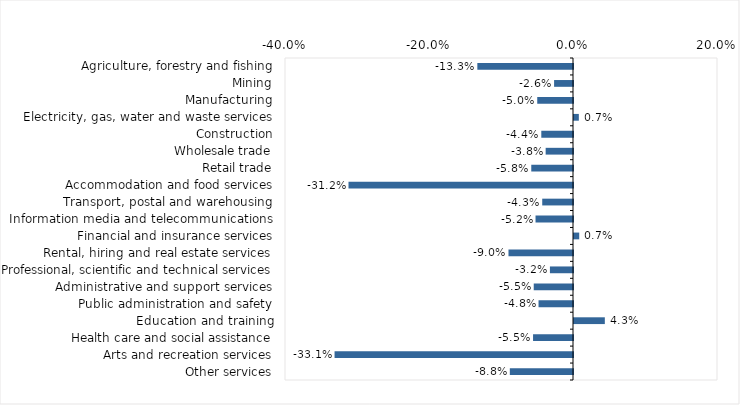
| Category | This week |
|---|---|
| Agriculture, forestry and fishing | -0.133 |
| Mining | -0.026 |
| Manufacturing | -0.05 |
| Electricity, gas, water and waste services | 0.007 |
| Construction | -0.044 |
| Wholesale trade | -0.038 |
| Retail trade | -0.058 |
| Accommodation and food services | -0.312 |
| Transport, postal and warehousing | -0.043 |
| Information media and telecommunications | -0.052 |
| Financial and insurance services | 0.007 |
| Rental, hiring and real estate services | -0.09 |
| Professional, scientific and technical services | -0.032 |
| Administrative and support services | -0.055 |
| Public administration and safety | -0.048 |
| Education and training | 0.043 |
| Health care and social assistance | -0.055 |
| Arts and recreation services | -0.331 |
| Other services | -0.088 |